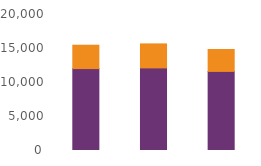
| Category | Online | Telephony |
|---|---|---|
| May23 | 12047 | 3436 |
| Jun23 | 12149 | 3528 |
| Jul23 | 11631 | 3224 |